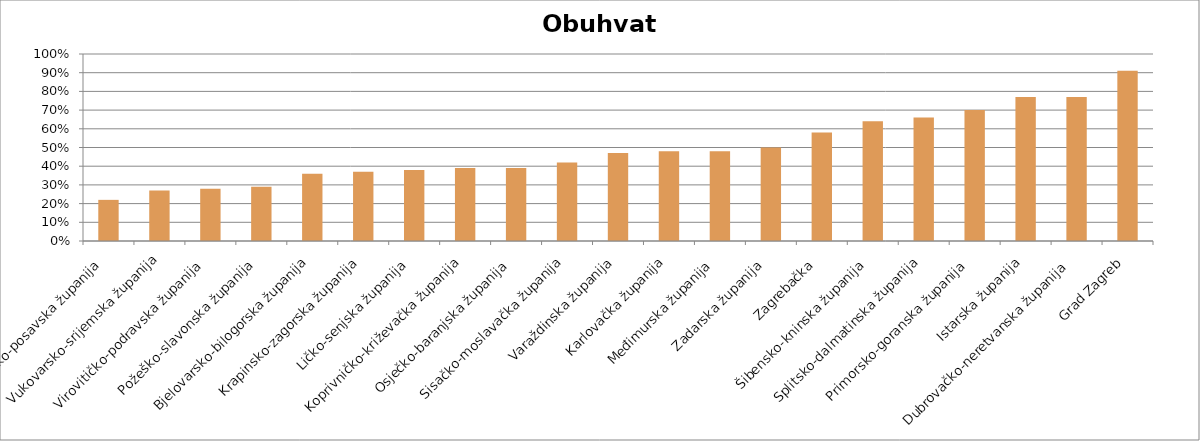
| Category | Obuhvat 3-5 |
|---|---|
| Brodsko-posavska županija  | 0.22 |
| Vukovarsko-srijemska županija | 0.27 |
| Virovitičko-podravska županija  | 0.28 |
| Požeško-slavonska županija  | 0.29 |
| Bjelovarsko-bilogorska županija  | 0.36 |
| Krapinsko-zagorska županija | 0.37 |
| Ličko-senjska županija  | 0.38 |
| Koprivničko-križevačka županija  | 0.39 |
| Osječko-baranjska županija  | 0.39 |
| Sisačko-moslavačka županija | 0.42 |
| Varaždinska županija | 0.47 |
| Karlovačka županija | 0.48 |
| Međimurska županija  | 0.48 |
| Zadarska županija  | 0.5 |
| Zagrebačka  | 0.58 |
| Šibensko-kninska županija  | 0.64 |
| Splitsko-dalmatinska županija  | 0.66 |
| Primorsko-goranska županija  | 0.7 |
| Istarska županija  | 0.77 |
| Dubrovačko-neretvanska županija  | 0.77 |
| Grad Zagreb | 0.91 |